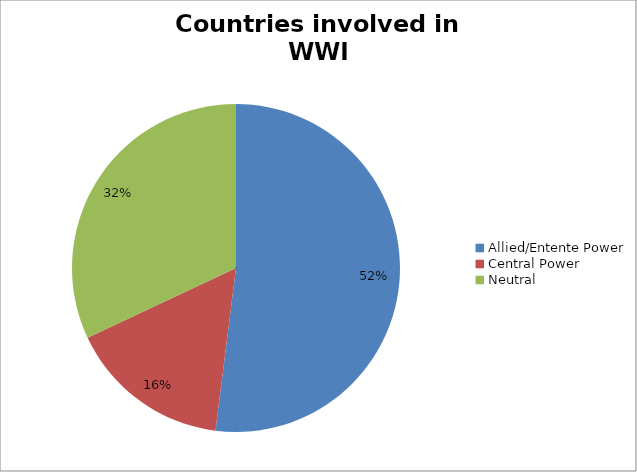
| Category | Series 0 |
|---|---|
| Allied/Entente Power | 13 |
| Central Power | 4 |
| Neutral | 8 |